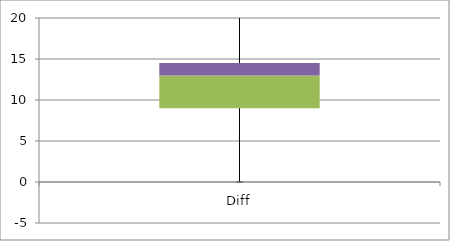
| Category | Min | Q1-Min | Med-Q1 | Q3-Med |
|---|---|---|---|---|
| Diff | -10 | 9 | 4 | 1.5 |